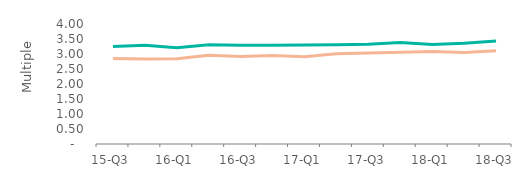
| Category | First-time
buyers | Home movers |
|---|---|---|
| 15-Q3 | 3.25 | 2.85 |
| 15-Q4 | 3.29 | 2.83 |
| 16-Q1 | 3.21 | 2.84 |
| 16-Q2 | 3.31 | 2.96 |
| 16-Q3 | 3.29 | 2.92 |
| 16-Q4 | 3.29 | 2.95 |
| 17-Q1 | 3.3 | 2.91 |
| 17-Q2 | 3.31 | 3.01 |
| 17-Q3 | 3.325 | 3.03 |
| 17-Q4 | 3.385 | 3.06 |
| 18-Q1 | 3.32 | 3.08 |
| 18-Q2 | 3.36 | 3.05 |
| 18-Q3 | 3.43 | 3.11 |